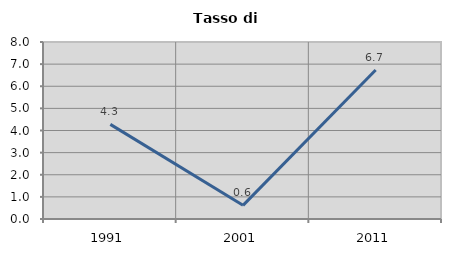
| Category | Tasso di disoccupazione   |
|---|---|
| 1991.0 | 4.278 |
| 2001.0 | 0.617 |
| 2011.0 | 6.736 |